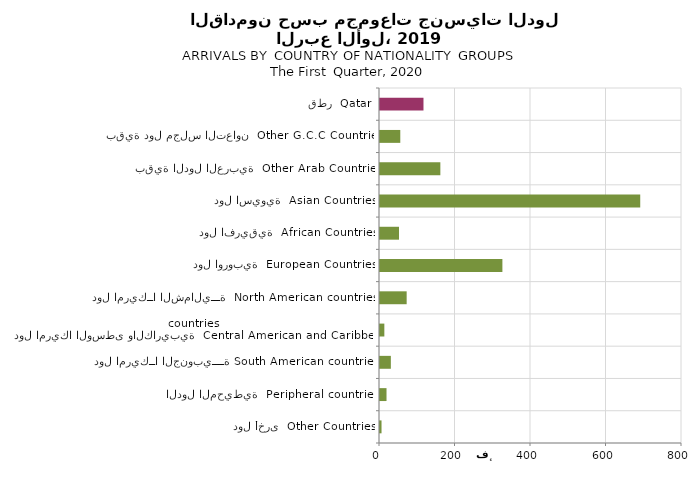
| Category | Series 0 |
|---|---|
| دول أخرى  Other Countries | 4031 |
| الدول المحيطية  Peripheral countries | 17255 |
| دول امريكــا الجنوبيــــة South American countries | 28735 |
| دول امريكا الوسطى والكاريبية  Central American and Caribbean countries | 11500 |
| دول امريكــا الشماليـــة  North American countries  | 70632 |
| دول اوروبية  European Countries | 324218 |
| دول افريقية  African Countries | 50338 |
| دول اسيوية  Asian Countries | 689361 |
| بقية الدول العربية  Other Arab Countries | 159870 |
| بقية دول مجلس التعاون  Other G.C.C Countries | 53746 |
| قطر  Qatar | 115180 |